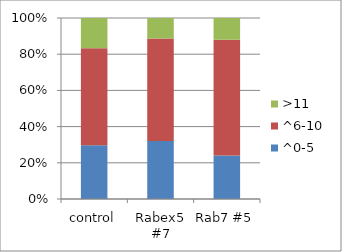
| Category | ^0-5 | ^6-10 | >11 |
|---|---|---|---|
| control | 29.63 | 53.704 | 16.667 |
| Rabex5 #7 | 32.075 | 56.604 | 11.321 |
| Rab7 #5 | 24 | 64 | 12 |